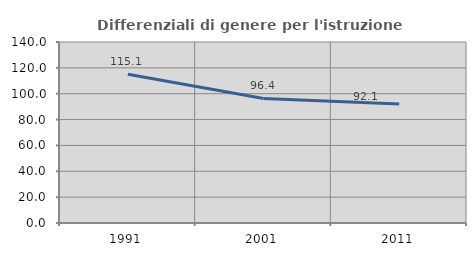
| Category | Differenziali di genere per l'istruzione superiore |
|---|---|
| 1991.0 | 115.11 |
| 2001.0 | 96.371 |
| 2011.0 | 92.102 |